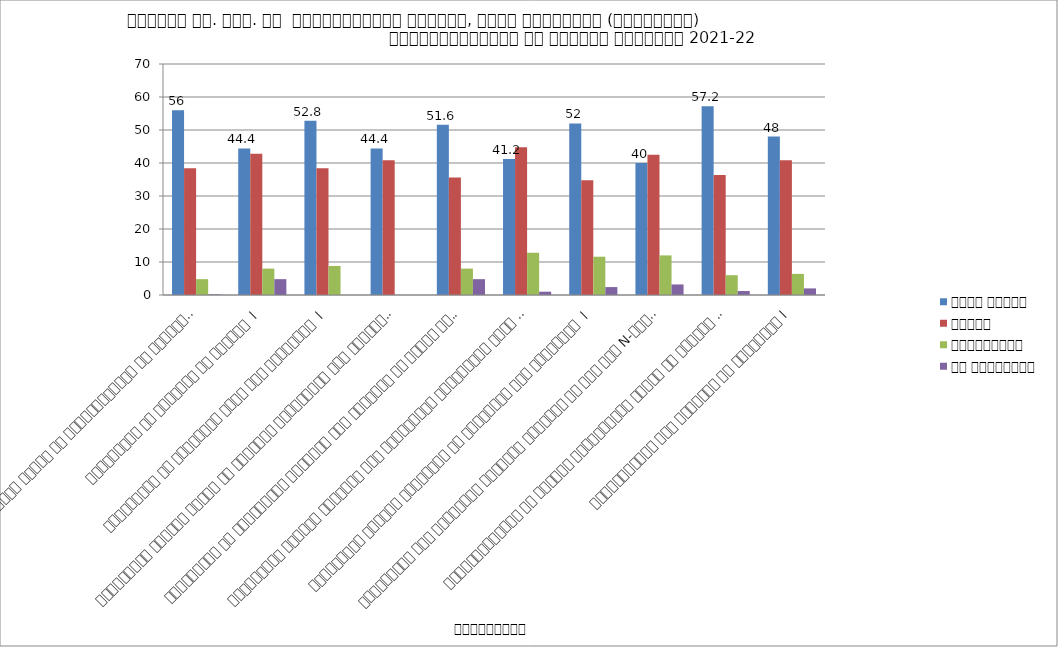
| Category | बहुत अच्छा  | अच्छा  | संतोषप्रद | कम संतोषजनक  |
|---|---|---|---|---|
| पाठ्यक्रम व् प्रोजेक्ट कार्य की विश्यय्वस्तु की महत्ता  l | 56 | 38.4 | 4.8 | 0.2 |
| पाठ्यक्रम के पूर्णता का स्वरुप  l | 44.4 | 42.8 | 8 | 4.8 |
| पाठ्यक्रम की वास्तविक जीवन में उपयोगिता  l | 52.8 | 38.4 | 8.8 | 0 |
| पाठ्यक्रम द्वारा ज्ञान व् विशलेषण दृष्टिकोण में वृद्धि l | 44.4 | 40.8 | 0 | 0 |
| पाठ्यक्रम के प्रायोगिक कार्यों एवं विशलेषण के प्रति छात्रों की रुचि l | 51.6 | 35.6 | 8 | 4.8 |
| पाठ्यक्रम द्वारा छात्रों में वैज्ञानिक दृष्टिकोण करने का प्रयास l  | 41.2 | 44.8 | 12.8 | 1 |
| पाठ्यक्रम संबंधी पुस्तकों की ग्रंथालय में उपलब्धता  l  | 52 | 34.8 | 11.6 | 2.4 |
| पुस्तकालय में अतिरिक्त स्त्रोत सामग्री के रूप में N-लिस्ट की उपलब्धता | 40 | 42.5 | 12 | 3.2 |
| विद्यार्थीयों के आंतरिक मूल्याङ्कन कार्य की महत्ता  l | 57.2 | 36.4 | 6 | 1.2 |
| महाविद्यालय में उपकरणों की उपलब्धता l | 48 | 40.8 | 6.4 | 2 |